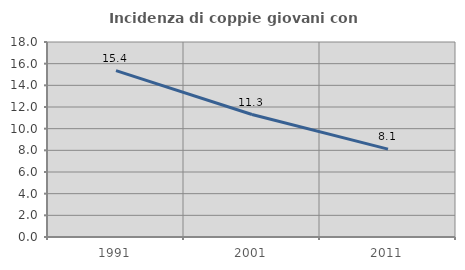
| Category | Incidenza di coppie giovani con figli |
|---|---|
| 1991.0 | 15.355 |
| 2001.0 | 11.304 |
| 2011.0 | 8.114 |